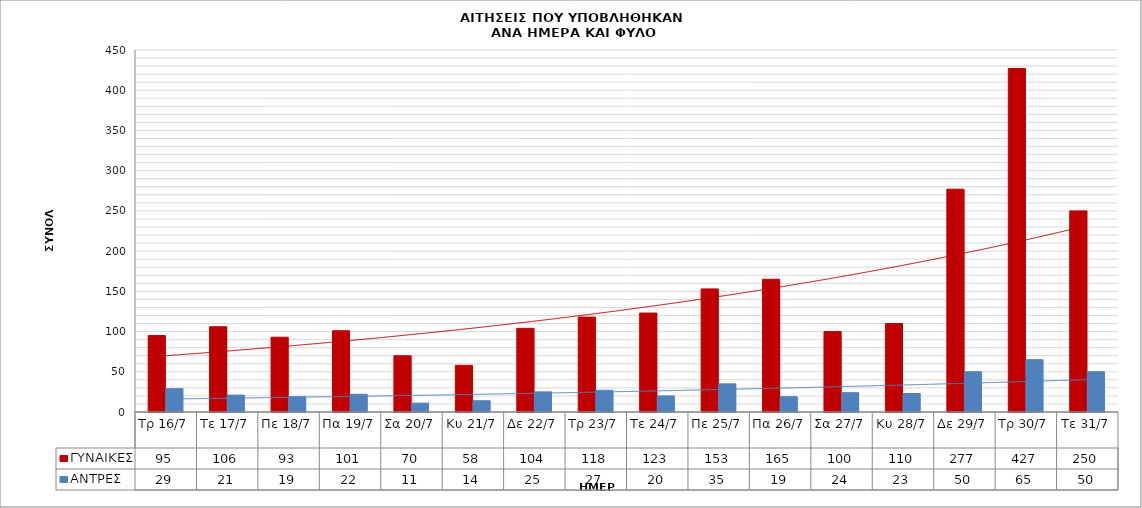
| Category | ΓΥΝΑΙΚΕΣ | ΑΝΤΡΕΣ |
|---|---|---|
| Τρ 16/7 | 95 | 29 |
| Τε 17/7 | 106 | 21 |
| Πε 18/7 | 93 | 19 |
| Πα 19/7 | 101 | 22 |
| Σα 20/7 | 70 | 11 |
| Κυ 21/7 | 58 | 14 |
| Δε 22/7 | 104 | 25 |
| Τρ 23/7 | 118 | 27 |
| Τε 24/7 | 123 | 20 |
| Πε 25/7 | 153 | 35 |
| Πα 26/7 | 165 | 19 |
| Σα 27/7 | 100 | 24 |
| Κυ 28/7 | 110 | 23 |
| Δε 29/7 | 277 | 50 |
| Τρ 30/7 | 427 | 65 |
| Τε 31/7 | 250 | 50 |